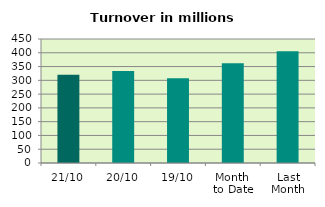
| Category | Series 0 |
|---|---|
| 21/10 | 320.043 |
| 20/10 | 333.429 |
| 19/10 | 307.182 |
| Month 
to Date | 361.666 |
| Last
Month | 405.806 |